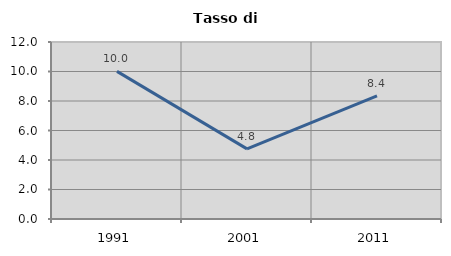
| Category | Tasso di disoccupazione   |
|---|---|
| 1991.0 | 10.01 |
| 2001.0 | 4.754 |
| 2011.0 | 8.353 |